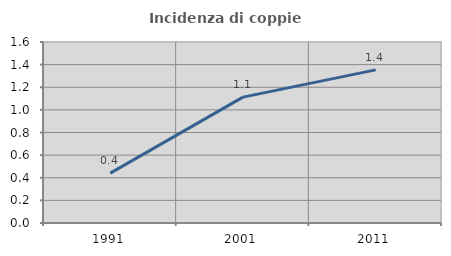
| Category | Incidenza di coppie miste |
|---|---|
| 1991.0 | 0.441 |
| 2001.0 | 1.113 |
| 2011.0 | 1.354 |